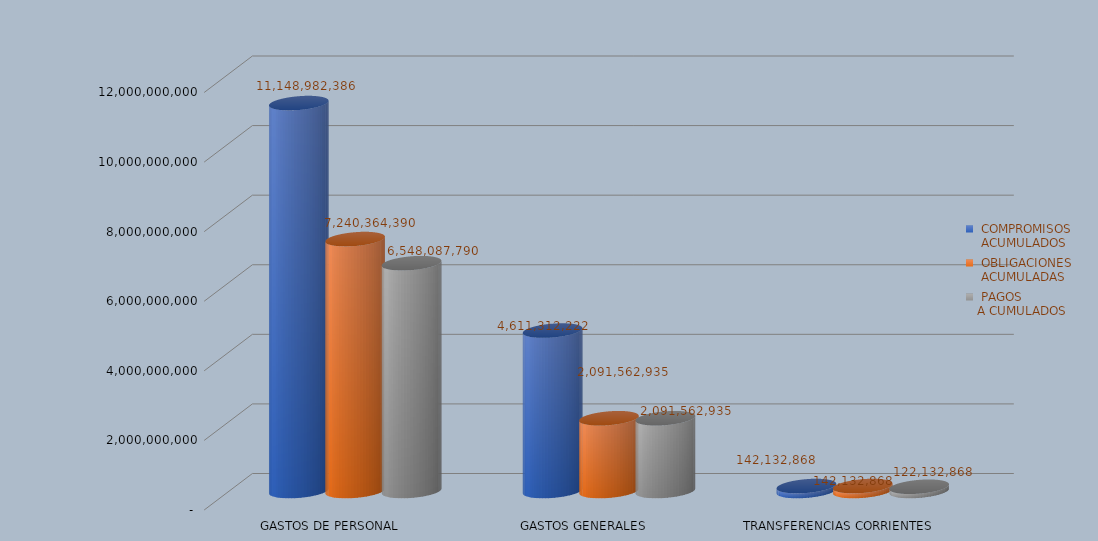
| Category |  COMPROMISOS
 ACUMULADOS |  OBLIGACIONES
 ACUMULADAS |  PAGOS
A CUMULADOS |
|---|---|---|---|
| GASTOS DE PERSONAL | 11148982386 | 7240364390 | 6548087790 |
| GASTOS GENERALES | 4611312221.66 | 2091562935.11 | 2091562935.11 |
| TRANSFERENCIAS CORRIENTES | 142132868 | 142132868 | 122132868 |